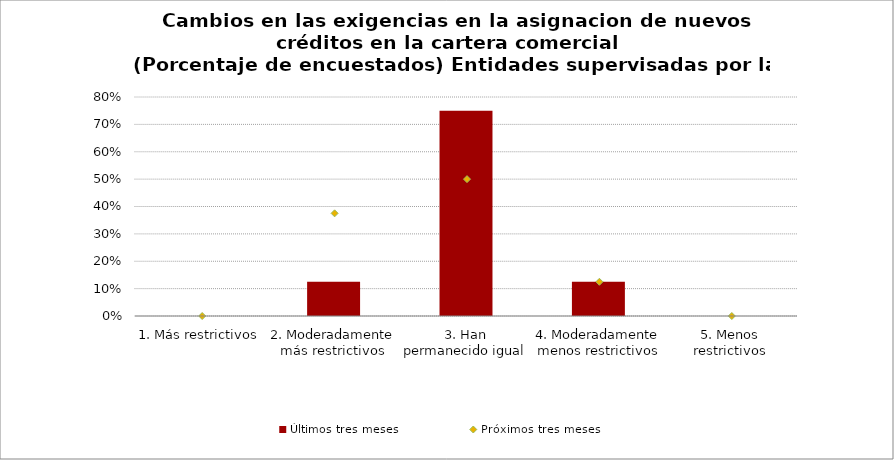
| Category | Últimos tres meses |
|---|---|
| 1. Más restrictivos | 0 |
| 2. Moderadamente más restrictivos | 0.125 |
| 3. Han permanecido igual | 0.75 |
| 4. Moderadamente menos restrictivos | 0.125 |
| 5. Menos restrictivos | 0 |